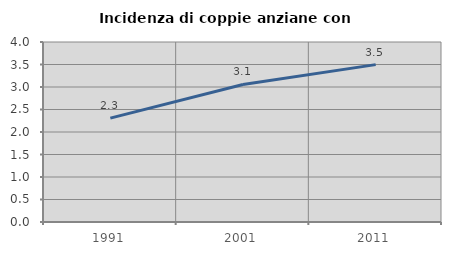
| Category | Incidenza di coppie anziane con figli |
|---|---|
| 1991.0 | 2.308 |
| 2001.0 | 3.056 |
| 2011.0 | 3.498 |